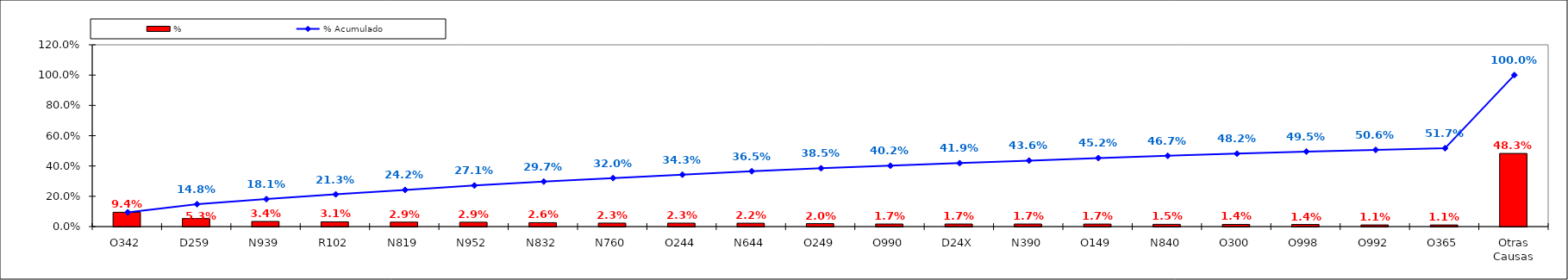
| Category | % |
|---|---|
| O342 | 0.094 |
| D259 | 0.053 |
| N939 | 0.034 |
| R102 | 0.031 |
| N819 | 0.029 |
| N952 | 0.029 |
| N832 | 0.026 |
| N760 | 0.023 |
| O244 | 0.023 |
| N644 | 0.022 |
| O249 | 0.02 |
| O990 | 0.017 |
| D24X | 0.017 |
| N390 | 0.017 |
| O149 | 0.017 |
| N840 | 0.015 |
| O300 | 0.014 |
| O998 | 0.014 |
| O992 | 0.011 |
| O365 | 0.011 |
| Otras Causas | 0.483 |